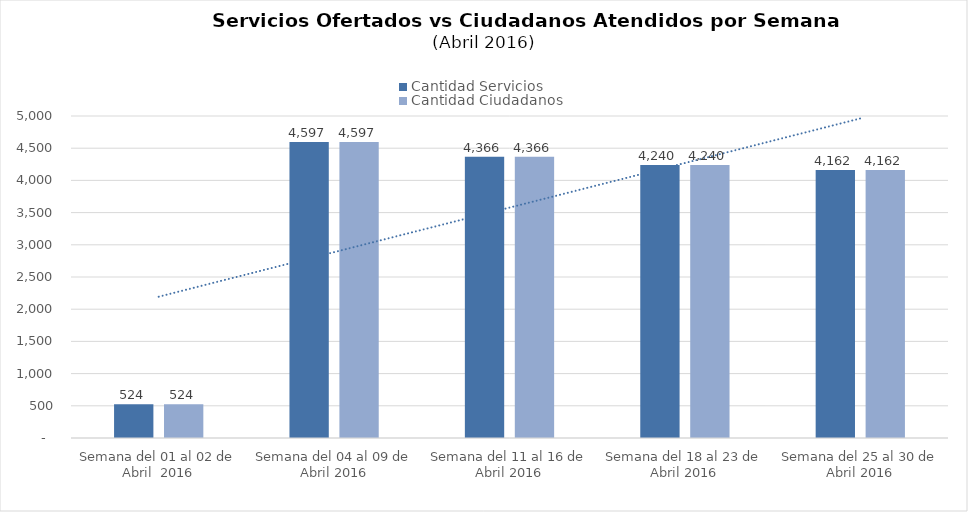
| Category | Cantidad Servicios | Cantidad Ciudadanos |
|---|---|---|
| Semana del 01 al 02 de Abril  2016 | 524 | 524 |
| Semana del 04 al 09 de Abril 2016 | 4597 | 4597 |
| Semana del 11 al 16 de Abril 2016 | 4366 | 4366 |
| Semana del 18 al 23 de Abril 2016 | 4240 | 4240 |
| Semana del 25 al 30 de Abril 2016 | 4162 | 4162 |